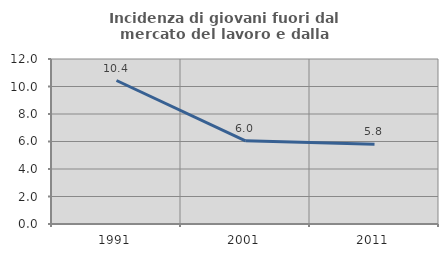
| Category | Incidenza di giovani fuori dal mercato del lavoro e dalla formazione  |
|---|---|
| 1991.0 | 10.436 |
| 2001.0 | 6.046 |
| 2011.0 | 5.797 |